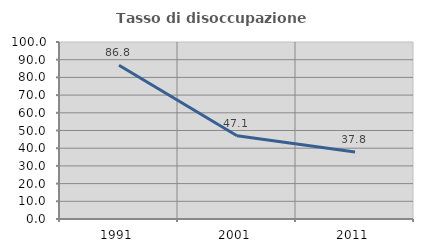
| Category | Tasso di disoccupazione giovanile  |
|---|---|
| 1991.0 | 86.842 |
| 2001.0 | 47.059 |
| 2011.0 | 37.838 |